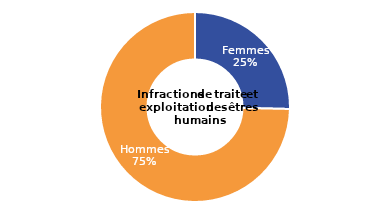
| Category | Series 0 |
|---|---|
| Femmes | 25.333 |
| Hommes | 74.667 |